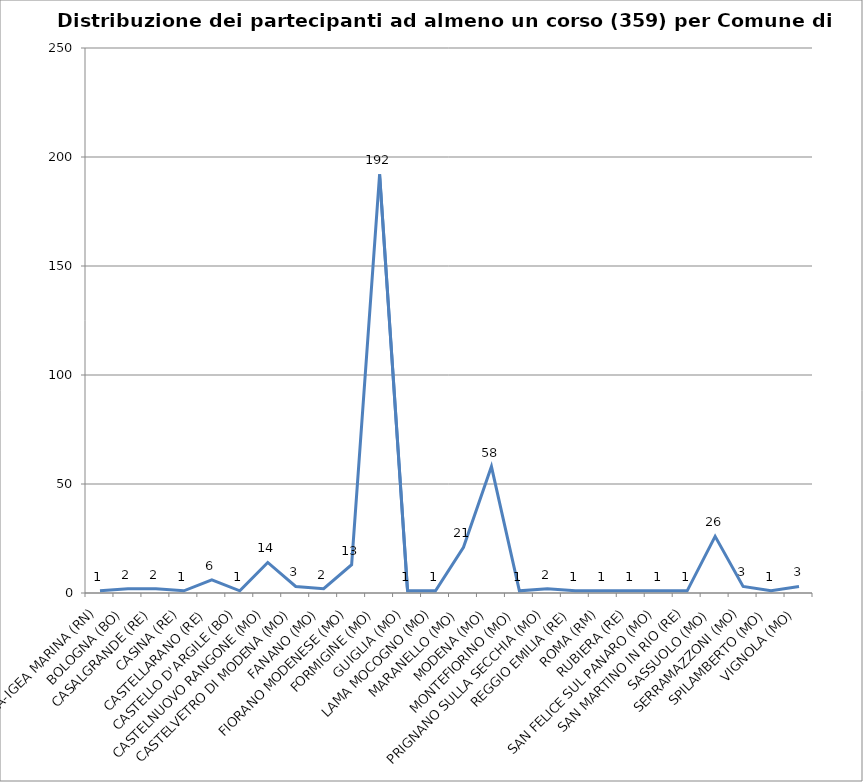
| Category | Nr. Tesserati |
|---|---|
| BELLARIA-IGEA MARINA (RN) | 1 |
| BOLOGNA (BO) | 2 |
| CASALGRANDE (RE) | 2 |
| CASINA (RE) | 1 |
| CASTELLARANO (RE) | 6 |
| CASTELLO D'ARGILE (BO) | 1 |
| CASTELNUOVO RANGONE (MO) | 14 |
| CASTELVETRO DI MODENA (MO) | 3 |
| FANANO (MO) | 2 |
| FIORANO MODENESE (MO) | 13 |
| FORMIGINE (MO) | 192 |
| GUIGLIA (MO) | 1 |
| LAMA MOCOGNO (MO) | 1 |
| MARANELLO (MO) | 21 |
| MODENA (MO) | 58 |
| MONTEFIORINO (MO) | 1 |
| PRIGNANO SULLA SECCHIA (MO) | 2 |
| REGGIO EMILIA (RE) | 1 |
| ROMA (RM) | 1 |
| RUBIERA (RE) | 1 |
| SAN FELICE SUL PANARO (MO) | 1 |
| SAN MARTINO IN RIO (RE) | 1 |
| SASSUOLO (MO) | 26 |
| SERRAMAZZONI (MO) | 3 |
| SPILAMBERTO (MO) | 1 |
| VIGNOLA (MO) | 3 |